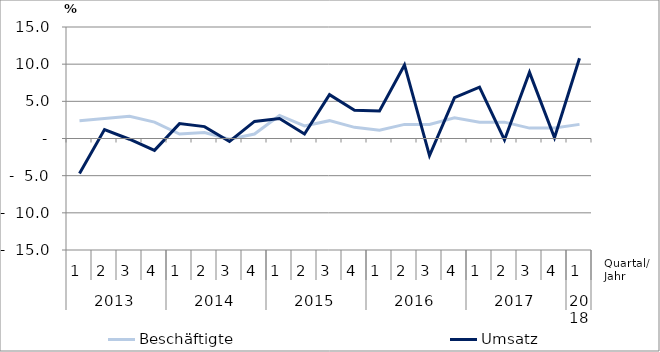
| Category | Beschäftigte | Umsatz |
|---|---|---|
| 0 | 2.4 | -4.7 |
| 1 | 2.7 | 1.2 |
| 2 | 3 | -0.1 |
| 3 | 2.2 | -1.6 |
| 4 | 0.6 | 2 |
| 5 | 0.8 | 1.6 |
| 6 | -0.1 | -0.4 |
| 7 | 0.6 | 2.3 |
| 8 | 3.1 | 2.7 |
| 9 | 1.7 | 0.6 |
| 10 | 2.4 | 5.9 |
| 11 | 1.5 | 3.8 |
| 12 | 1.1 | 3.7 |
| 13 | 1.9 | 9.9 |
| 14 | 1.9 | -2.3 |
| 15 | 2.8 | 5.5 |
| 16 | 2.2 | 6.9 |
| 17 | 2.2 | -0.2 |
| 18 | 1.4 | 8.9 |
| 19 | 1.4 | 0.1 |
| 20 | 1.9 | 10.8 |